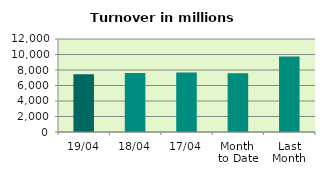
| Category | Series 0 |
|---|---|
| 19/04 | 7453.719 |
| 18/04 | 7619.245 |
| 17/04 | 7691.011 |
| Month 
to Date | 7573.692 |
| Last
Month | 9734.736 |